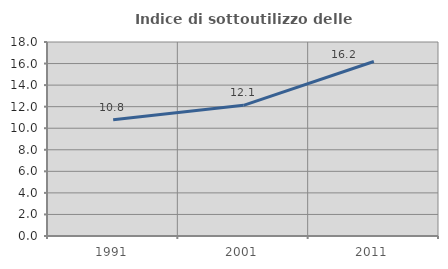
| Category | Indice di sottoutilizzo delle abitazioni  |
|---|---|
| 1991.0 | 10.784 |
| 2001.0 | 12.121 |
| 2011.0 | 16.194 |